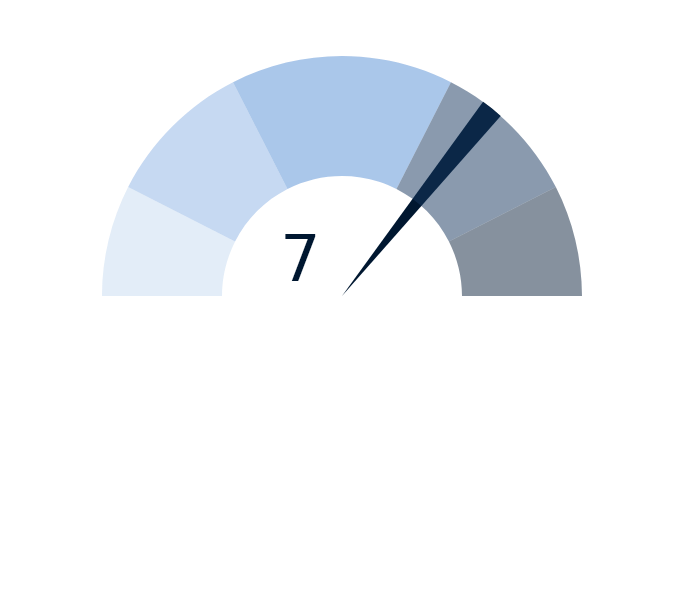
| Category | Series 2 |
|---|---|
| 0 | 7 |
| 1 | 0.3 |
| 2 | 12.7 |